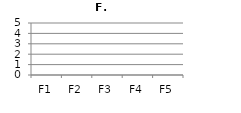
| Category | Gemiddelde |
|---|---|
| F1 | 0 |
| F2 | 0 |
| F3 | 0 |
| F4 | 0 |
| F5 | 0 |